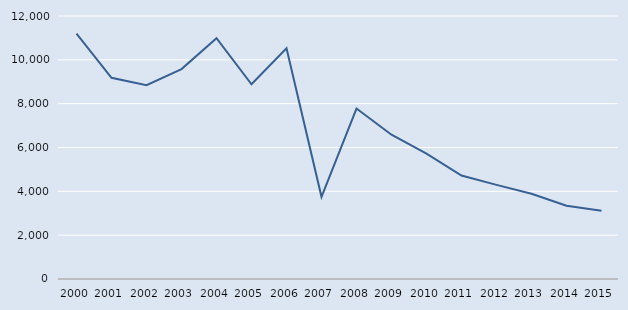
| Category | Series 0 |
|---|---|
| 2000.0 | 11201 |
| 2001.0 | 9182 |
| 2002.0 | 8844 |
| 2003.0 | 9577 |
| 2004.0 | 10988 |
| 2005.0 | 8884 |
| 2006.0 | 10524 |
| 2007.0 | 3749 |
| 2008.0 | 7778 |
| 2009.0 | 6583 |
| 2010.0 | 5723 |
| 2011.0 | 4720 |
| 2012.0 | 4294 |
| 2013.0 | 3887 |
| 2014.0 | 3345 |
| 2015.0 | 3109 |